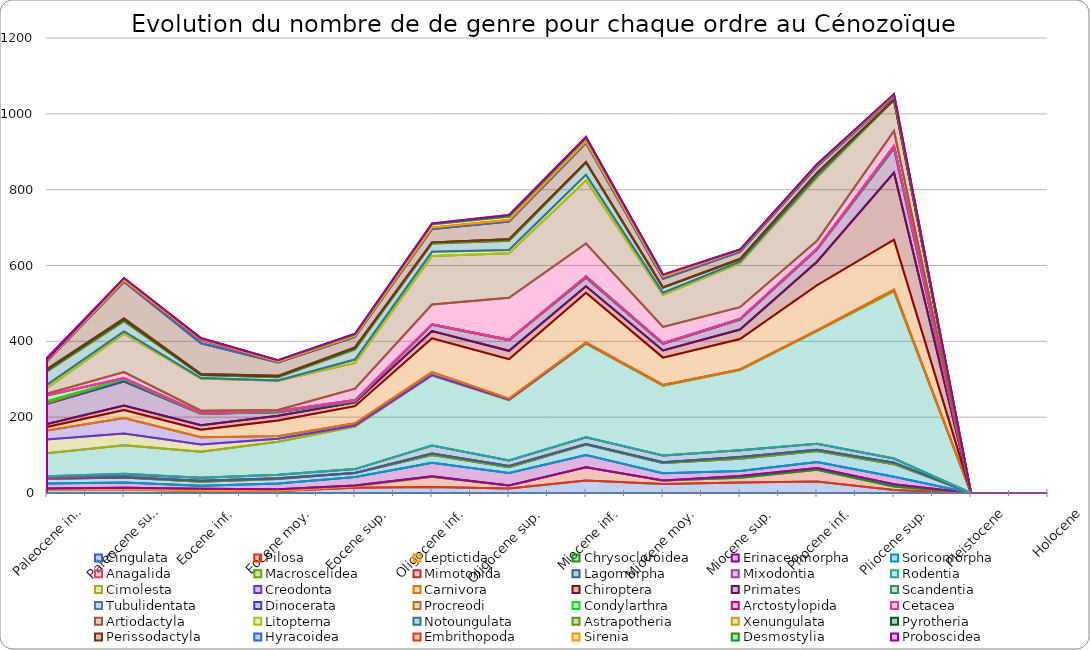
| Category | Cingulata | Pilosa | Leptictida | Chrysocloroidea | Erinaceomorpha | Soricomorpha | Anagalida | Macroscelidea | Mimotonida | Lagomorpha | Mixodontia | Rodentia | Cimolesta | Creodonta | Carnivora | Chiroptera | Primates | Scandentia | Tubulidentata | Dinocerata | Procreodi | Condylarthra | Arctostylopida | Cetacea | Artiodactyla | Litopterna | Notoungulata | Astrapotheria | Xenungulata | Pyrotheria | Perissodactyla | Hyracoidea | Embrithopoda | Sirenia | Desmostylia | Proboscidea |
|---|---|---|---|---|---|---|---|---|---|---|---|---|---|---|---|---|---|---|---|---|---|---|---|---|---|---|---|---|---|---|---|---|---|---|---|---|
| Paleocene inf. | 9 | 0 | 3 | 0 | 13 | 12 | 1 | 0 | 1 | 0 | 5 | 61 | 36 | 24 | 9 | 8 | 53 | 0 | 0 | 2 | 5 | 15 | 1 | 4 | 15 | 8 | 36 | 3 | 0 | 3 | 20 | 2 | 0 | 3 | 0 | 5 |
|  Paleocene sup. | 9 | 1 | 4 | 0 | 14 | 13 | 0 | 0 | 1 | 7 | 2 | 75 | 31 | 41 | 21 | 12 | 63 | 1 | 0 | 5 | 0 | 3 | 0 | 16 | 101 | 6 | 27 | 4 | 0 | 3 | 97 | 3 | 1 | 6 | 0 | 0 |
| Eocene inf. | 5 | 1 | 5 | 0 | 8 | 11 | 0 | 2 | 0 | 8 | 0 | 69 | 19 | 19 | 20 | 12 | 30 | 0 | 0 | 0 | 1 | 1 | 0 | 6 | 85 | 1 | 8 | 1 | 0 | 2 | 81 | 8 | 2 | 3 | 0 | 1 |
| Eocene moy. | 5 | 1 | 4 | 0 | 15 | 12 | 1 | 0 | 1 | 9 | 0 | 87 | 8 | 7 | 41 | 13 | 9 | 0 | 2 | 0 | 0 | 1 | 0 | 3 | 77 | 1 | 8 | 2 | 0 | 2 | 35 | 2 | 1 | 3 | 0 | 0 |
| Eocene sup. | 14 | 4 | 2 | 0 | 22 | 11 | 0 | 0 | 0 | 10 | 0 | 112 | 3 | 6 | 45 | 10 | 3 | 0 | 2 | 0 | 0 | 1 | 0 | 30 | 68 | 9 | 27 | 3 | 0 | 2 | 28 | 2 | 0 | 4 | 2 | 0 |
| Oligocene inf. | 16 | 27 | 0 | 1 | 36 | 20 | 0 | 4 | 0 | 21 | 0 | 185 | 1 | 8 | 89 | 19 | 17 | 0 | 1 | 0 | 0 | 0 | 0 | 52 | 128 | 11 | 22 | 3 | 0 | 0 | 35 | 4 | 0 | 9 | 2 | 0 |
| Oligocene sup. | 12 | 8 | 0 | 0 | 33 | 15 | 0 | 3 | 0 | 15 | 0 | 159 | 1 | 3 | 104 | 22 | 28 | 0 | 1 | 0 | 0 | 0 | 0 | 111 | 117 | 9 | 24 | 4 | 0 | 0 | 47 | 4 | 0 | 9 | 4 | 0 |
| Miocene inf. | 33 | 35 | 0 | 0 | 32 | 28 | 0 | 1 | 0 | 18 | 0 | 247 | 2 | 1 | 131 | 17 | 23 | 1 | 2 | 0 | 0 | 0 | 0 | 87 | 167 | 14 | 32 | 2 | 0 | 0 | 50 | 4 | 0 | 9 | 3 | 0 |
| Miocene moy. | 24 | 9 | 0 | 0 | 19 | 27 | 0 | 2 | 0 | 18 | 0 | 184 | 2 | 0 | 72 | 19 | 17 | 1 | 1 | 0 | 0 | 0 | 0 | 43 | 85 | 5 | 14 | 0 | 0 | 0 | 23 | 5 | 0 | 6 | 0 | 0 |
| Miocene sup. | 28 | 12 | 0 | 5 | 13 | 32 | 0 | 5 | 0 | 18 | 0 | 211 | 2 | 0 | 80 | 25 | 26 | 1 | 1 | 0 | 0 | 0 | 0 | 31 | 116 | 4 | 7 | 0 | 0 | 0 | 19 | 4 | 0 | 2 | 0 | 0 |
| Pliocene inf. | 30 | 31 | 0 | 5 | 16 | 29 | 0 | 3 | 0 | 16 | 0 | 297 | 2 | 0 | 119 | 62 | 32 | 1 | 1 | 0 | 0 | 0 | 0 | 21 | 167 | 4 | 8 | 0 | 0 | 0 | 17 | 4 | 0 | 2 | 0 | 0 |
| Pliocene sup. | 8 | 9 | 0 | 6 | 20 | 33 | 0 | 4 | 0 | 11 | 0 | 441 | 4 | 0 | 132 | 177 | 64 | 5 | 1 | 0 | 0 | 0 | 0 | 40 | 82 | 0 | 0 | 0 | 0 | 0 | 9 | 3 | 0 | 3 | 0 | 0 |
| Pleistocene | 0 | 0 | 0 | 0 | 0 | 0 | 0 | 0 | 0 | 0 | 0 | 0 | 0 | 0 | 0 | 0 | 0 | 0 | 0 | 0 | 0 | 0 | 0 | 0 | 0 | 0 | 0 | 0 | 0 | 0 | 0 | 0 | 0 | 0 | 0 | 0 |
| Holocene | 0 | 0 | 0 | 0 | 0 | 0 | 0 | 0 | 0 | 0 | 0 | 0 | 0 | 0 | 0 | 0 | 0 | 0 | 0 | 0 | 0 | 0 | 0 | 0 | 0 | 0 | 0 | 0 | 0 | 0 | 0 | 0 | 0 | 0 | 0 | 0 |